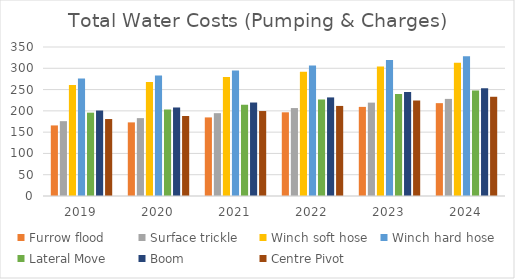
| Category | Furrow flood | Surface trickle | Winch soft hose | Winch hard hose | Lateral Move | Boom | Centre Pivot |
|---|---|---|---|---|---|---|---|
| 2019.0 | 165.79 | 175.79 | 260.79 | 275.79 | 195.79 | 200.79 | 180.79 |
| 2020.0 | 172.93 | 182.93 | 267.93 | 282.93 | 202.93 | 207.93 | 187.93 |
| 2021.0 | 184.586 | 194.586 | 279.586 | 294.586 | 214.586 | 219.586 | 199.586 |
| 2022.0 | 196.574 | 206.574 | 291.574 | 306.574 | 226.574 | 231.574 | 211.574 |
| 2023.0 | 209.326 | 219.326 | 304.326 | 319.326 | 239.326 | 244.326 | 224.326 |
| 2024.0 | 218.095 | 228.095 | 313.095 | 328.095 | 248.095 | 253.095 | 233.095 |